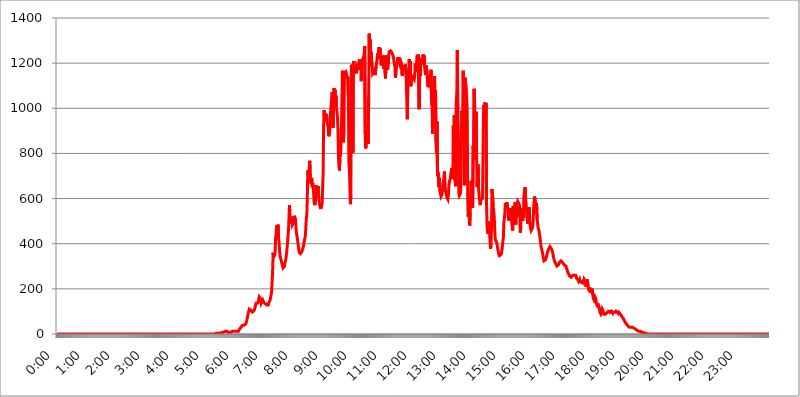
| Category | 2015.05.04. Intenzitás [W/m^2] |
|---|---|
| 0.0 | 0 |
| 0.0006944444444444445 | 0 |
| 0.001388888888888889 | 0 |
| 0.0020833333333333333 | 0 |
| 0.002777777777777778 | 0 |
| 0.003472222222222222 | 0 |
| 0.004166666666666667 | 0 |
| 0.004861111111111111 | 0 |
| 0.005555555555555556 | 0 |
| 0.0062499999999999995 | 0 |
| 0.006944444444444444 | 0 |
| 0.007638888888888889 | 0 |
| 0.008333333333333333 | 0 |
| 0.009027777777777779 | 0 |
| 0.009722222222222222 | 0 |
| 0.010416666666666666 | 0 |
| 0.011111111111111112 | 0 |
| 0.011805555555555555 | 0 |
| 0.012499999999999999 | 0 |
| 0.013194444444444444 | 0 |
| 0.013888888888888888 | 0 |
| 0.014583333333333332 | 0 |
| 0.015277777777777777 | 0 |
| 0.015972222222222224 | 0 |
| 0.016666666666666666 | 0 |
| 0.017361111111111112 | 0 |
| 0.018055555555555557 | 0 |
| 0.01875 | 0 |
| 0.019444444444444445 | 0 |
| 0.02013888888888889 | 0 |
| 0.020833333333333332 | 0 |
| 0.02152777777777778 | 0 |
| 0.022222222222222223 | 0 |
| 0.02291666666666667 | 0 |
| 0.02361111111111111 | 0 |
| 0.024305555555555556 | 0 |
| 0.024999999999999998 | 0 |
| 0.025694444444444447 | 0 |
| 0.02638888888888889 | 0 |
| 0.027083333333333334 | 0 |
| 0.027777777777777776 | 0 |
| 0.02847222222222222 | 0 |
| 0.029166666666666664 | 0 |
| 0.029861111111111113 | 0 |
| 0.030555555555555555 | 0 |
| 0.03125 | 0 |
| 0.03194444444444445 | 0 |
| 0.03263888888888889 | 0 |
| 0.03333333333333333 | 0 |
| 0.034027777777777775 | 0 |
| 0.034722222222222224 | 0 |
| 0.035416666666666666 | 0 |
| 0.036111111111111115 | 0 |
| 0.03680555555555556 | 0 |
| 0.0375 | 0 |
| 0.03819444444444444 | 0 |
| 0.03888888888888889 | 0 |
| 0.03958333333333333 | 0 |
| 0.04027777777777778 | 0 |
| 0.04097222222222222 | 0 |
| 0.041666666666666664 | 0 |
| 0.042361111111111106 | 0 |
| 0.04305555555555556 | 0 |
| 0.043750000000000004 | 0 |
| 0.044444444444444446 | 0 |
| 0.04513888888888889 | 0 |
| 0.04583333333333334 | 0 |
| 0.04652777777777778 | 0 |
| 0.04722222222222222 | 0 |
| 0.04791666666666666 | 0 |
| 0.04861111111111111 | 0 |
| 0.049305555555555554 | 0 |
| 0.049999999999999996 | 0 |
| 0.05069444444444445 | 0 |
| 0.051388888888888894 | 0 |
| 0.052083333333333336 | 0 |
| 0.05277777777777778 | 0 |
| 0.05347222222222222 | 0 |
| 0.05416666666666667 | 0 |
| 0.05486111111111111 | 0 |
| 0.05555555555555555 | 0 |
| 0.05625 | 0 |
| 0.05694444444444444 | 0 |
| 0.057638888888888885 | 0 |
| 0.05833333333333333 | 0 |
| 0.05902777777777778 | 0 |
| 0.059722222222222225 | 0 |
| 0.06041666666666667 | 0 |
| 0.061111111111111116 | 0 |
| 0.06180555555555556 | 0 |
| 0.0625 | 0 |
| 0.06319444444444444 | 0 |
| 0.06388888888888888 | 0 |
| 0.06458333333333334 | 0 |
| 0.06527777777777778 | 0 |
| 0.06597222222222222 | 0 |
| 0.06666666666666667 | 0 |
| 0.06736111111111111 | 0 |
| 0.06805555555555555 | 0 |
| 0.06874999999999999 | 0 |
| 0.06944444444444443 | 0 |
| 0.07013888888888889 | 0 |
| 0.07083333333333333 | 0 |
| 0.07152777777777779 | 0 |
| 0.07222222222222223 | 0 |
| 0.07291666666666667 | 0 |
| 0.07361111111111111 | 0 |
| 0.07430555555555556 | 0 |
| 0.075 | 0 |
| 0.07569444444444444 | 0 |
| 0.0763888888888889 | 0 |
| 0.07708333333333334 | 0 |
| 0.07777777777777778 | 0 |
| 0.07847222222222222 | 0 |
| 0.07916666666666666 | 0 |
| 0.0798611111111111 | 0 |
| 0.08055555555555556 | 0 |
| 0.08125 | 0 |
| 0.08194444444444444 | 0 |
| 0.08263888888888889 | 0 |
| 0.08333333333333333 | 0 |
| 0.08402777777777777 | 0 |
| 0.08472222222222221 | 0 |
| 0.08541666666666665 | 0 |
| 0.08611111111111112 | 0 |
| 0.08680555555555557 | 0 |
| 0.08750000000000001 | 0 |
| 0.08819444444444445 | 0 |
| 0.08888888888888889 | 0 |
| 0.08958333333333333 | 0 |
| 0.09027777777777778 | 0 |
| 0.09097222222222222 | 0 |
| 0.09166666666666667 | 0 |
| 0.09236111111111112 | 0 |
| 0.09305555555555556 | 0 |
| 0.09375 | 0 |
| 0.09444444444444444 | 0 |
| 0.09513888888888888 | 0 |
| 0.09583333333333333 | 0 |
| 0.09652777777777777 | 0 |
| 0.09722222222222222 | 0 |
| 0.09791666666666667 | 0 |
| 0.09861111111111111 | 0 |
| 0.09930555555555555 | 0 |
| 0.09999999999999999 | 0 |
| 0.10069444444444443 | 0 |
| 0.1013888888888889 | 0 |
| 0.10208333333333335 | 0 |
| 0.10277777777777779 | 0 |
| 0.10347222222222223 | 0 |
| 0.10416666666666667 | 0 |
| 0.10486111111111111 | 0 |
| 0.10555555555555556 | 0 |
| 0.10625 | 0 |
| 0.10694444444444444 | 0 |
| 0.1076388888888889 | 0 |
| 0.10833333333333334 | 0 |
| 0.10902777777777778 | 0 |
| 0.10972222222222222 | 0 |
| 0.1111111111111111 | 0 |
| 0.11180555555555556 | 0 |
| 0.11180555555555556 | 0 |
| 0.1125 | 0 |
| 0.11319444444444444 | 0 |
| 0.11388888888888889 | 0 |
| 0.11458333333333333 | 0 |
| 0.11527777777777777 | 0 |
| 0.11597222222222221 | 0 |
| 0.11666666666666665 | 0 |
| 0.1173611111111111 | 0 |
| 0.11805555555555557 | 0 |
| 0.11944444444444445 | 0 |
| 0.12013888888888889 | 0 |
| 0.12083333333333333 | 0 |
| 0.12152777777777778 | 0 |
| 0.12222222222222223 | 0 |
| 0.12291666666666667 | 0 |
| 0.12291666666666667 | 0 |
| 0.12361111111111112 | 0 |
| 0.12430555555555556 | 0 |
| 0.125 | 0 |
| 0.12569444444444444 | 0 |
| 0.12638888888888888 | 0 |
| 0.12708333333333333 | 0 |
| 0.16875 | 0 |
| 0.12847222222222224 | 0 |
| 0.12916666666666668 | 0 |
| 0.12986111111111112 | 0 |
| 0.13055555555555556 | 0 |
| 0.13125 | 0 |
| 0.13194444444444445 | 0 |
| 0.1326388888888889 | 0 |
| 0.13333333333333333 | 0 |
| 0.13402777777777777 | 0 |
| 0.13402777777777777 | 0 |
| 0.13472222222222222 | 0 |
| 0.13541666666666666 | 0 |
| 0.1361111111111111 | 0 |
| 0.13749999999999998 | 0 |
| 0.13819444444444443 | 0 |
| 0.1388888888888889 | 0 |
| 0.13958333333333334 | 0 |
| 0.14027777777777778 | 0 |
| 0.14097222222222222 | 0 |
| 0.14166666666666666 | 0 |
| 0.1423611111111111 | 0 |
| 0.14305555555555557 | 0 |
| 0.14375000000000002 | 0 |
| 0.14444444444444446 | 0 |
| 0.1451388888888889 | 0 |
| 0.1451388888888889 | 0 |
| 0.14652777777777778 | 0 |
| 0.14722222222222223 | 0 |
| 0.14791666666666667 | 0 |
| 0.1486111111111111 | 0 |
| 0.14930555555555555 | 0 |
| 0.15 | 0 |
| 0.15069444444444444 | 0 |
| 0.15138888888888888 | 0 |
| 0.15208333333333332 | 0 |
| 0.15277777777777776 | 0 |
| 0.15347222222222223 | 0 |
| 0.15416666666666667 | 0 |
| 0.15486111111111112 | 0 |
| 0.15555555555555556 | 0 |
| 0.15625 | 0 |
| 0.15694444444444444 | 0 |
| 0.15763888888888888 | 0 |
| 0.15833333333333333 | 0 |
| 0.15902777777777777 | 0 |
| 0.15972222222222224 | 0 |
| 0.16041666666666668 | 0 |
| 0.16111111111111112 | 0 |
| 0.16180555555555556 | 0 |
| 0.1625 | 0 |
| 0.16319444444444445 | 0 |
| 0.1638888888888889 | 0 |
| 0.16458333333333333 | 0 |
| 0.16527777777777777 | 0 |
| 0.16597222222222222 | 0 |
| 0.16666666666666666 | 0 |
| 0.1673611111111111 | 0 |
| 0.16805555555555554 | 0 |
| 0.16874999999999998 | 0 |
| 0.16944444444444443 | 0 |
| 0.17013888888888887 | 0 |
| 0.1708333333333333 | 0 |
| 0.17152777777777775 | 0 |
| 0.17222222222222225 | 0 |
| 0.1729166666666667 | 0 |
| 0.17361111111111113 | 0 |
| 0.17430555555555557 | 0 |
| 0.17500000000000002 | 0 |
| 0.17569444444444446 | 0 |
| 0.1763888888888889 | 0 |
| 0.17708333333333334 | 0 |
| 0.17777777777777778 | 0 |
| 0.17847222222222223 | 0 |
| 0.17916666666666667 | 0 |
| 0.1798611111111111 | 0 |
| 0.18055555555555555 | 0 |
| 0.18125 | 0 |
| 0.18194444444444444 | 0 |
| 0.1826388888888889 | 0 |
| 0.18333333333333335 | 0 |
| 0.1840277777777778 | 0 |
| 0.18472222222222223 | 0 |
| 0.18541666666666667 | 0 |
| 0.18611111111111112 | 0 |
| 0.18680555555555556 | 0 |
| 0.1875 | 0 |
| 0.18819444444444444 | 0 |
| 0.18888888888888888 | 0 |
| 0.18958333333333333 | 0 |
| 0.19027777777777777 | 0 |
| 0.1909722222222222 | 0 |
| 0.19166666666666665 | 0 |
| 0.19236111111111112 | 0 |
| 0.19305555555555554 | 0 |
| 0.19375 | 0 |
| 0.19444444444444445 | 0 |
| 0.1951388888888889 | 0 |
| 0.19583333333333333 | 0 |
| 0.19652777777777777 | 0 |
| 0.19722222222222222 | 0 |
| 0.19791666666666666 | 0 |
| 0.1986111111111111 | 0 |
| 0.19930555555555554 | 0 |
| 0.19999999999999998 | 0 |
| 0.20069444444444443 | 0 |
| 0.20138888888888887 | 0 |
| 0.2020833333333333 | 0 |
| 0.2027777777777778 | 0 |
| 0.2034722222222222 | 0 |
| 0.2041666666666667 | 0 |
| 0.20486111111111113 | 0 |
| 0.20555555555555557 | 0 |
| 0.20625000000000002 | 0 |
| 0.20694444444444446 | 0 |
| 0.2076388888888889 | 0 |
| 0.20833333333333334 | 0 |
| 0.20902777777777778 | 0 |
| 0.20972222222222223 | 0 |
| 0.21041666666666667 | 0 |
| 0.2111111111111111 | 0 |
| 0.21180555555555555 | 0 |
| 0.2125 | 0 |
| 0.21319444444444444 | 0 |
| 0.2138888888888889 | 0 |
| 0.21458333333333335 | 0 |
| 0.2152777777777778 | 0 |
| 0.21597222222222223 | 0 |
| 0.21666666666666667 | 0 |
| 0.21736111111111112 | 0 |
| 0.21805555555555556 | 0 |
| 0.21875 | 0 |
| 0.21944444444444444 | 0 |
| 0.22013888888888888 | 0 |
| 0.22083333333333333 | 0 |
| 0.22152777777777777 | 0 |
| 0.2222222222222222 | 3.525 |
| 0.22291666666666665 | 3.525 |
| 0.2236111111111111 | 3.525 |
| 0.22430555555555556 | 3.525 |
| 0.225 | 3.525 |
| 0.22569444444444445 | 3.525 |
| 0.2263888888888889 | 3.525 |
| 0.22708333333333333 | 3.525 |
| 0.22777777777777777 | 3.525 |
| 0.22847222222222222 | 3.525 |
| 0.22916666666666666 | 3.525 |
| 0.2298611111111111 | 7.887 |
| 0.23055555555555554 | 7.887 |
| 0.23124999999999998 | 7.887 |
| 0.23194444444444443 | 7.887 |
| 0.23263888888888887 | 7.887 |
| 0.2333333333333333 | 7.887 |
| 0.2340277777777778 | 7.887 |
| 0.2347222222222222 | 7.887 |
| 0.2354166666666667 | 12.257 |
| 0.23611111111111113 | 12.257 |
| 0.23680555555555557 | 12.257 |
| 0.23750000000000002 | 12.257 |
| 0.23819444444444446 | 7.887 |
| 0.2388888888888889 | 7.887 |
| 0.23958333333333334 | 7.887 |
| 0.24027777777777778 | 7.887 |
| 0.24097222222222223 | 7.887 |
| 0.24166666666666667 | 7.887 |
| 0.2423611111111111 | 7.887 |
| 0.24305555555555555 | 7.887 |
| 0.24375 | 7.887 |
| 0.24444444444444446 | 7.887 |
| 0.24513888888888888 | 7.887 |
| 0.24583333333333335 | 12.257 |
| 0.2465277777777778 | 12.257 |
| 0.24722222222222223 | 12.257 |
| 0.24791666666666667 | 12.257 |
| 0.24861111111111112 | 12.257 |
| 0.24930555555555556 | 12.257 |
| 0.25 | 12.257 |
| 0.25069444444444444 | 12.257 |
| 0.2513888888888889 | 12.257 |
| 0.2520833333333333 | 12.257 |
| 0.25277777777777777 | 12.257 |
| 0.2534722222222222 | 12.257 |
| 0.25416666666666665 | 12.257 |
| 0.2548611111111111 | 16.636 |
| 0.2555555555555556 | 21.024 |
| 0.25625000000000003 | 21.024 |
| 0.2569444444444445 | 25.419 |
| 0.2576388888888889 | 29.823 |
| 0.25833333333333336 | 34.234 |
| 0.2590277777777778 | 34.234 |
| 0.25972222222222224 | 38.653 |
| 0.2604166666666667 | 34.234 |
| 0.2611111111111111 | 34.234 |
| 0.26180555555555557 | 38.653 |
| 0.2625 | 38.653 |
| 0.26319444444444445 | 38.653 |
| 0.2638888888888889 | 43.079 |
| 0.26458333333333334 | 47.511 |
| 0.2652777777777778 | 51.951 |
| 0.2659722222222222 | 60.85 |
| 0.26666666666666666 | 74.246 |
| 0.2673611111111111 | 83.205 |
| 0.26805555555555555 | 96.682 |
| 0.26875 | 101.184 |
| 0.26944444444444443 | 110.201 |
| 0.2701388888888889 | 110.201 |
| 0.2708333333333333 | 110.201 |
| 0.27152777777777776 | 105.69 |
| 0.2722222222222222 | 101.184 |
| 0.27291666666666664 | 101.184 |
| 0.2736111111111111 | 96.682 |
| 0.2743055555555555 | 96.682 |
| 0.27499999999999997 | 101.184 |
| 0.27569444444444446 | 101.184 |
| 0.27638888888888885 | 105.69 |
| 0.27708333333333335 | 114.716 |
| 0.2777777777777778 | 123.758 |
| 0.27847222222222223 | 132.814 |
| 0.2791666666666667 | 137.347 |
| 0.2798611111111111 | 137.347 |
| 0.28055555555555556 | 137.347 |
| 0.28125 | 137.347 |
| 0.28194444444444444 | 141.884 |
| 0.2826388888888889 | 155.509 |
| 0.2833333333333333 | 164.605 |
| 0.28402777777777777 | 164.605 |
| 0.2847222222222222 | 164.605 |
| 0.28541666666666665 | 155.509 |
| 0.28611111111111115 | 137.347 |
| 0.28680555555555554 | 137.347 |
| 0.28750000000000003 | 146.423 |
| 0.2881944444444445 | 150.964 |
| 0.2888888888888889 | 150.964 |
| 0.28958333333333336 | 141.884 |
| 0.2902777777777778 | 137.347 |
| 0.29097222222222224 | 137.347 |
| 0.2916666666666667 | 137.347 |
| 0.2923611111111111 | 132.814 |
| 0.29305555555555557 | 132.814 |
| 0.29375 | 128.284 |
| 0.29444444444444445 | 128.284 |
| 0.2951388888888889 | 128.284 |
| 0.29583333333333334 | 128.284 |
| 0.2965277777777778 | 137.347 |
| 0.2972222222222222 | 141.884 |
| 0.29791666666666666 | 146.423 |
| 0.2986111111111111 | 150.964 |
| 0.29930555555555555 | 164.605 |
| 0.3 | 173.709 |
| 0.30069444444444443 | 191.937 |
| 0.3013888888888889 | 233 |
| 0.3020833333333333 | 283.156 |
| 0.30277777777777776 | 360.221 |
| 0.3034722222222222 | 342.162 |
| 0.30416666666666664 | 342.162 |
| 0.3048611111111111 | 346.682 |
| 0.3055555555555555 | 360.221 |
| 0.30624999999999997 | 422.943 |
| 0.3069444444444444 | 440.702 |
| 0.3076388888888889 | 480.356 |
| 0.30833333333333335 | 431.833 |
| 0.3090277777777778 | 462.786 |
| 0.30972222222222223 | 484.735 |
| 0.3104166666666667 | 422.943 |
| 0.3111111111111111 | 405.108 |
| 0.31180555555555556 | 369.23 |
| 0.3125 | 346.682 |
| 0.31319444444444444 | 346.682 |
| 0.3138888888888889 | 328.584 |
| 0.3145833333333333 | 319.517 |
| 0.31527777777777777 | 319.517 |
| 0.3159722222222222 | 301.354 |
| 0.31666666666666665 | 292.259 |
| 0.31736111111111115 | 292.259 |
| 0.31805555555555554 | 296.808 |
| 0.31875000000000003 | 301.354 |
| 0.3194444444444445 | 314.98 |
| 0.3201388888888889 | 324.052 |
| 0.32083333333333336 | 337.639 |
| 0.3215277777777778 | 355.712 |
| 0.32222222222222224 | 378.224 |
| 0.3229166666666667 | 400.638 |
| 0.3236111111111111 | 431.833 |
| 0.32430555555555557 | 458.38 |
| 0.325 | 458.38 |
| 0.32569444444444445 | 571.049 |
| 0.3263888888888889 | 510.885 |
| 0.32708333333333334 | 497.836 |
| 0.3277777777777778 | 489.108 |
| 0.3284722222222222 | 484.735 |
| 0.32916666666666666 | 519.555 |
| 0.3298611111111111 | 484.735 |
| 0.33055555555555555 | 480.356 |
| 0.33125 | 493.475 |
| 0.33194444444444443 | 510.885 |
| 0.3326388888888889 | 523.88 |
| 0.3333333333333333 | 523.88 |
| 0.3340277777777778 | 506.542 |
| 0.3347222222222222 | 480.356 |
| 0.3354166666666667 | 449.551 |
| 0.3361111111111111 | 436.27 |
| 0.3368055555555556 | 422.943 |
| 0.33749999999999997 | 405.108 |
| 0.33819444444444446 | 387.202 |
| 0.33888888888888885 | 369.23 |
| 0.33958333333333335 | 360.221 |
| 0.34027777777777773 | 360.221 |
| 0.34097222222222223 | 355.712 |
| 0.3416666666666666 | 355.712 |
| 0.3423611111111111 | 355.712 |
| 0.3430555555555555 | 364.728 |
| 0.34375 | 373.729 |
| 0.3444444444444445 | 378.224 |
| 0.3451388888888889 | 387.202 |
| 0.3458333333333334 | 396.164 |
| 0.34652777777777777 | 414.035 |
| 0.34722222222222227 | 422.943 |
| 0.34791666666666665 | 431.833 |
| 0.34861111111111115 | 471.582 |
| 0.34930555555555554 | 510.885 |
| 0.35000000000000003 | 528.2 |
| 0.3506944444444444 | 600.661 |
| 0.3513888888888889 | 723.889 |
| 0.3520833333333333 | 727.896 |
| 0.3527777777777778 | 703.762 |
| 0.3534722222222222 | 731.896 |
| 0.3541666666666667 | 767.62 |
| 0.3548611111111111 | 691.608 |
| 0.35555555555555557 | 667.123 |
| 0.35625 | 683.473 |
| 0.35694444444444445 | 691.608 |
| 0.3576388888888889 | 650.667 |
| 0.35833333333333334 | 667.123 |
| 0.3590277777777778 | 650.667 |
| 0.3597222222222222 | 617.436 |
| 0.36041666666666666 | 579.542 |
| 0.3611111111111111 | 571.049 |
| 0.36180555555555555 | 579.542 |
| 0.3625 | 596.45 |
| 0.36319444444444443 | 658.909 |
| 0.3638888888888889 | 634.105 |
| 0.3645833333333333 | 625.784 |
| 0.3652777777777778 | 617.436 |
| 0.3659722222222222 | 654.791 |
| 0.3666666666666667 | 604.864 |
| 0.3673611111111111 | 588.009 |
| 0.3680555555555556 | 571.049 |
| 0.36874999999999997 | 566.793 |
| 0.36944444444444446 | 553.986 |
| 0.37013888888888885 | 549.704 |
| 0.37083333333333335 | 553.986 |
| 0.37152777777777773 | 579.542 |
| 0.37222222222222223 | 583.779 |
| 0.3729166666666666 | 711.832 |
| 0.3736111111111111 | 925.06 |
| 0.3743055555555555 | 992.448 |
| 0.375 | 940.082 |
| 0.3756944444444445 | 977.508 |
| 0.3763888888888889 | 951.327 |
| 0.3770833333333334 | 955.071 |
| 0.37777777777777777 | 973.772 |
| 0.37847222222222227 | 943.832 |
| 0.37916666666666665 | 928.819 |
| 0.37986111111111115 | 913.766 |
| 0.38055555555555554 | 875.918 |
| 0.38125000000000003 | 872.114 |
| 0.3819444444444444 | 887.309 |
| 0.3826388888888889 | 925.06 |
| 0.3833333333333333 | 981.244 |
| 0.3840277777777778 | 977.508 |
| 0.3847222222222222 | 1037.277 |
| 0.3854166666666667 | 1071.027 |
| 0.3861111111111111 | 1059.756 |
| 0.38680555555555557 | 913.766 |
| 0.3875 | 1018.587 |
| 0.38819444444444445 | 1089.873 |
| 0.3888888888888889 | 1037.277 |
| 0.38958333333333334 | 1082.324 |
| 0.3902777777777778 | 1014.852 |
| 0.3909722222222222 | 1056.004 |
| 0.39166666666666666 | 999.916 |
| 0.3923611111111111 | 984.98 |
| 0.39305555555555555 | 958.814 |
| 0.39375 | 902.447 |
| 0.39444444444444443 | 783.342 |
| 0.3951388888888889 | 739.877 |
| 0.3958333333333333 | 723.889 |
| 0.3965277777777778 | 802.868 |
| 0.3972222222222222 | 787.258 |
| 0.3979166666666667 | 860.676 |
| 0.3986111111111111 | 917.534 |
| 0.3993055555555556 | 913.766 |
| 0.39999999999999997 | 1166.46 |
| 0.40069444444444446 | 932.576 |
| 0.40138888888888885 | 849.199 |
| 0.40208333333333335 | 906.223 |
| 0.40277777777777773 | 1158.689 |
| 0.40347222222222223 | 1158.689 |
| 0.4041666666666666 | 1162.571 |
| 0.4048611111111111 | 1162.571 |
| 0.4055555555555555 | 1154.814 |
| 0.40625 | 1143.232 |
| 0.4069444444444445 | 1131.708 |
| 0.4076388888888889 | 1139.384 |
| 0.4083333333333334 | 1052.255 |
| 0.40902777777777777 | 755.766 |
| 0.40972222222222227 | 727.896 |
| 0.41041666666666665 | 650.667 |
| 0.41111111111111115 | 575.299 |
| 0.41180555555555554 | 617.436 |
| 0.41250000000000003 | 1189.969 |
| 0.4131944444444444 | 1120.238 |
| 0.4138888888888889 | 1193.918 |
| 0.4145833333333333 | 802.868 |
| 0.4152777777777778 | 1178.177 |
| 0.4159722222222222 | 1209.807 |
| 0.4166666666666667 | 1154.814 |
| 0.4173611111111111 | 1193.918 |
| 0.41805555555555557 | 1193.918 |
| 0.41875 | 1182.099 |
| 0.41944444444444445 | 1154.814 |
| 0.4201388888888889 | 1158.689 |
| 0.42083333333333334 | 1186.03 |
| 0.4215277777777778 | 1186.03 |
| 0.4222222222222222 | 1186.03 |
| 0.42291666666666666 | 1170.358 |
| 0.4236111111111111 | 1209.807 |
| 0.42430555555555555 | 1209.807 |
| 0.425 | 1209.807 |
| 0.42569444444444443 | 1205.82 |
| 0.4263888888888889 | 1120.238 |
| 0.4270833333333333 | 1217.812 |
| 0.4277777777777778 | 1205.82 |
| 0.4284722222222222 | 1205.82 |
| 0.4291666666666667 | 1221.83 |
| 0.4298611111111111 | 1225.859 |
| 0.4305555555555556 | 1242.089 |
| 0.43124999999999997 | 1275.142 |
| 0.43194444444444446 | 887.309 |
| 0.43263888888888885 | 822.26 |
| 0.43333333333333335 | 845.365 |
| 0.43402777777777773 | 925.06 |
| 0.43472222222222223 | 917.534 |
| 0.4354166666666666 | 902.447 |
| 0.4361111111111111 | 841.526 |
| 0.4368055555555555 | 1052.255 |
| 0.4375 | 1330.826 |
| 0.4381944444444445 | 1186.03 |
| 0.4388888888888889 | 1304.795 |
| 0.4395833333333334 | 1229.899 |
| 0.44027777777777777 | 1250.275 |
| 0.44097222222222227 | 1209.807 |
| 0.44166666666666665 | 1193.918 |
| 0.44236111111111115 | 1154.814 |
| 0.44305555555555554 | 1154.814 |
| 0.44375000000000003 | 1150.946 |
| 0.4444444444444444 | 1166.46 |
| 0.4451388888888889 | 1162.571 |
| 0.4458333333333333 | 1147.086 |
| 0.4465277777777778 | 1143.232 |
| 0.4472222222222222 | 1186.03 |
| 0.4479166666666667 | 1189.969 |
| 0.4486111111111111 | 1217.812 |
| 0.44930555555555557 | 1242.089 |
| 0.45 | 1217.812 |
| 0.45069444444444445 | 1254.387 |
| 0.4513888888888889 | 1270.964 |
| 0.45208333333333334 | 1254.387 |
| 0.4527777777777778 | 1266.8 |
| 0.4534722222222222 | 1221.83 |
| 0.45416666666666666 | 1189.969 |
| 0.4548611111111111 | 1186.03 |
| 0.45555555555555555 | 1205.82 |
| 0.45625 | 1217.812 |
| 0.45694444444444443 | 1233.951 |
| 0.4576388888888889 | 1229.899 |
| 0.4583333333333333 | 1174.263 |
| 0.4590277777777778 | 1229.899 |
| 0.4597222222222222 | 1158.689 |
| 0.4604166666666667 | 1131.708 |
| 0.4611111111111111 | 1233.951 |
| 0.4618055555555556 | 1193.918 |
| 0.46249999999999997 | 1182.099 |
| 0.46319444444444446 | 1170.358 |
| 0.46388888888888885 | 1182.099 |
| 0.46458333333333335 | 1205.82 |
| 0.46527777777777773 | 1250.275 |
| 0.46597222222222223 | 1246.176 |
| 0.4666666666666666 | 1254.387 |
| 0.4673611111111111 | 1254.387 |
| 0.4680555555555555 | 1258.511 |
| 0.46875 | 1250.275 |
| 0.4694444444444445 | 1246.176 |
| 0.4701388888888889 | 1242.089 |
| 0.4708333333333334 | 1233.951 |
| 0.47152777777777777 | 1225.859 |
| 0.47222222222222227 | 1209.807 |
| 0.47291666666666665 | 1209.807 |
| 0.47361111111111115 | 1182.099 |
| 0.47430555555555554 | 1135.543 |
| 0.47500000000000003 | 1150.946 |
| 0.4756944444444444 | 1178.177 |
| 0.4763888888888889 | 1193.918 |
| 0.4770833333333333 | 1213.804 |
| 0.4777777777777778 | 1225.859 |
| 0.4784722222222222 | 1217.812 |
| 0.4791666666666667 | 1225.859 |
| 0.4798611111111111 | 1201.843 |
| 0.48055555555555557 | 1193.918 |
| 0.48125 | 1197.876 |
| 0.48194444444444445 | 1205.82 |
| 0.4826388888888889 | 1197.876 |
| 0.48333333333333334 | 1150.946 |
| 0.4840277777777778 | 1143.232 |
| 0.4847222222222222 | 1139.384 |
| 0.48541666666666666 | 1170.358 |
| 0.4861111111111111 | 1174.263 |
| 0.48680555555555555 | 1189.969 |
| 0.4875 | 1166.46 |
| 0.48819444444444443 | 1193.918 |
| 0.4888888888888889 | 1170.358 |
| 0.4895833333333333 | 1112.618 |
| 0.4902777777777778 | 1116.426 |
| 0.4909722222222222 | 951.327 |
| 0.4916666666666667 | 1108.816 |
| 0.4923611111111111 | 1158.689 |
| 0.4930555555555556 | 1174.263 |
| 0.49374999999999997 | 1217.812 |
| 0.49444444444444446 | 1162.571 |
| 0.49513888888888885 | 1209.807 |
| 0.49583333333333335 | 1097.437 |
| 0.49652777777777773 | 1101.226 |
| 0.49722222222222223 | 1147.086 |
| 0.4979166666666666 | 1139.384 |
| 0.4986111111111111 | 1127.879 |
| 0.4993055555555555 | 1135.543 |
| 0.5 | 1135.543 |
| 0.5006944444444444 | 1127.879 |
| 0.5013888888888889 | 1143.232 |
| 0.5020833333333333 | 1197.876 |
| 0.5027777777777778 | 1162.571 |
| 0.5034722222222222 | 1193.918 |
| 0.5041666666666667 | 1170.358 |
| 0.5048611111111111 | 1233.951 |
| 0.5055555555555555 | 1209.807 |
| 0.50625 | 1238.014 |
| 0.5069444444444444 | 1238.014 |
| 0.5076388888888889 | 996.182 |
| 0.5083333333333333 | 1162.571 |
| 0.5090277777777777 | 1143.232 |
| 0.5097222222222222 | 1197.876 |
| 0.5104166666666666 | 1209.807 |
| 0.5111111111111112 | 1213.804 |
| 0.5118055555555555 | 1201.843 |
| 0.5125000000000001 | 1193.918 |
| 0.5131944444444444 | 1238.014 |
| 0.513888888888889 | 1221.83 |
| 0.5145833333333333 | 1233.951 |
| 0.5152777777777778 | 1182.099 |
| 0.5159722222222222 | 1182.099 |
| 0.5166666666666667 | 1147.086 |
| 0.517361111111111 | 1189.969 |
| 0.5180555555555556 | 1186.03 |
| 0.5187499999999999 | 1158.689 |
| 0.5194444444444445 | 1108.816 |
| 0.5201388888888888 | 1093.653 |
| 0.5208333333333334 | 1127.879 |
| 0.5215277777777778 | 1147.086 |
| 0.5222222222222223 | 1093.653 |
| 0.5229166666666667 | 1120.238 |
| 0.5236111111111111 | 1150.946 |
| 0.5243055555555556 | 1170.358 |
| 0.525 | 1018.587 |
| 0.5256944444444445 | 1007.383 |
| 0.5263888888888889 | 887.309 |
| 0.5270833333333333 | 996.182 |
| 0.5277777777777778 | 1056.004 |
| 0.5284722222222222 | 988.714 |
| 0.5291666666666667 | 1143.232 |
| 0.5298611111111111 | 955.071 |
| 0.5305555555555556 | 1078.555 |
| 0.53125 | 849.199 |
| 0.5319444444444444 | 798.974 |
| 0.5326388888888889 | 940.082 |
| 0.5333333333333333 | 699.717 |
| 0.5340277777777778 | 715.858 |
| 0.5347222222222222 | 715.858 |
| 0.5354166666666667 | 650.667 |
| 0.5361111111111111 | 691.608 |
| 0.5368055555555555 | 634.105 |
| 0.5375 | 621.613 |
| 0.5381944444444444 | 609.062 |
| 0.5388888888888889 | 604.864 |
| 0.5395833333333333 | 617.436 |
| 0.5402777777777777 | 621.613 |
| 0.5409722222222222 | 650.667 |
| 0.5416666666666666 | 671.22 |
| 0.5423611111111112 | 675.311 |
| 0.5430555555555555 | 719.877 |
| 0.5437500000000001 | 658.909 |
| 0.5444444444444444 | 638.256 |
| 0.545138888888889 | 625.784 |
| 0.5458333333333333 | 613.252 |
| 0.5465277777777778 | 604.864 |
| 0.5472222222222222 | 600.661 |
| 0.5479166666666667 | 596.45 |
| 0.548611111111111 | 617.436 |
| 0.5493055555555556 | 654.791 |
| 0.5499999999999999 | 675.311 |
| 0.5506944444444445 | 683.473 |
| 0.5513888888888888 | 691.608 |
| 0.5520833333333334 | 711.832 |
| 0.5527777777777778 | 711.832 |
| 0.5534722222222223 | 735.89 |
| 0.5541666666666667 | 687.544 |
| 0.5548611111111111 | 695.666 |
| 0.5555555555555556 | 925.06 |
| 0.55625 | 687.544 |
| 0.5569444444444445 | 970.034 |
| 0.5576388888888889 | 683.473 |
| 0.5583333333333333 | 671.22 |
| 0.5590277777777778 | 654.791 |
| 0.5597222222222222 | 1029.798 |
| 0.5604166666666667 | 1074.789 |
| 0.5611111111111111 | 1258.511 |
| 0.5618055555555556 | 981.244 |
| 0.5625 | 902.447 |
| 0.5631944444444444 | 625.784 |
| 0.5638888888888889 | 613.252 |
| 0.5645833333333333 | 609.062 |
| 0.5652777777777778 | 621.613 |
| 0.5659722222222222 | 638.256 |
| 0.5666666666666667 | 642.4 |
| 0.5673611111111111 | 988.714 |
| 0.5680555555555555 | 909.996 |
| 0.56875 | 849.199 |
| 0.5694444444444444 | 1166.46 |
| 0.5701388888888889 | 1007.383 |
| 0.5708333333333333 | 658.909 |
| 0.5715277777777777 | 671.22 |
| 0.5722222222222222 | 1135.543 |
| 0.5729166666666666 | 1139.384 |
| 0.5736111111111112 | 1074.789 |
| 0.5743055555555555 | 1044.762 |
| 0.5750000000000001 | 988.714 |
| 0.5756944444444444 | 609.062 |
| 0.576388888888889 | 519.555 |
| 0.5770833333333333 | 549.704 |
| 0.5777777777777778 | 519.555 |
| 0.5784722222222222 | 480.356 |
| 0.5791666666666667 | 536.82 |
| 0.579861111111111 | 621.613 |
| 0.5805555555555556 | 679.395 |
| 0.5812499999999999 | 617.436 |
| 0.5819444444444445 | 575.299 |
| 0.5826388888888888 | 558.261 |
| 0.5833333333333334 | 833.834 |
| 0.5840277777777778 | 806.757 |
| 0.5847222222222223 | 1086.097 |
| 0.5854166666666667 | 1014.852 |
| 0.5861111111111111 | 951.327 |
| 0.5868055555555556 | 771.559 |
| 0.5875 | 984.98 |
| 0.5881944444444445 | 783.342 |
| 0.5888888888888889 | 650.667 |
| 0.5895833333333333 | 703.762 |
| 0.5902777777777778 | 751.803 |
| 0.5909722222222222 | 642.4 |
| 0.5916666666666667 | 613.252 |
| 0.5923611111111111 | 592.233 |
| 0.5930555555555556 | 571.049 |
| 0.59375 | 583.779 |
| 0.5944444444444444 | 596.45 |
| 0.5951388888888889 | 600.661 |
| 0.5958333333333333 | 592.233 |
| 0.5965277777777778 | 600.661 |
| 0.5972222222222222 | 814.519 |
| 0.5979166666666667 | 1014.852 |
| 0.5986111111111111 | 909.996 |
| 0.5993055555555555 | 940.082 |
| 0.6 | 1026.06 |
| 0.6006944444444444 | 955.071 |
| 0.6013888888888889 | 1022.323 |
| 0.6020833333333333 | 575.299 |
| 0.6027777777777777 | 484.735 |
| 0.6034722222222222 | 445.129 |
| 0.6041666666666666 | 440.702 |
| 0.6048611111111112 | 497.836 |
| 0.6055555555555555 | 493.475 |
| 0.6062500000000001 | 453.968 |
| 0.6069444444444444 | 414.035 |
| 0.607638888888889 | 378.224 |
| 0.6083333333333333 | 391.685 |
| 0.6090277777777778 | 462.786 |
| 0.6097222222222222 | 642.4 |
| 0.6104166666666667 | 617.436 |
| 0.611111111111111 | 600.661 |
| 0.6118055555555556 | 549.704 |
| 0.6124999999999999 | 536.82 |
| 0.6131944444444445 | 497.836 |
| 0.6138888888888888 | 440.702 |
| 0.6145833333333334 | 414.035 |
| 0.6152777777777778 | 414.035 |
| 0.6159722222222223 | 409.574 |
| 0.6166666666666667 | 400.638 |
| 0.6173611111111111 | 387.202 |
| 0.6180555555555556 | 373.729 |
| 0.61875 | 360.221 |
| 0.6194444444444445 | 351.198 |
| 0.6201388888888889 | 346.682 |
| 0.6208333333333333 | 346.682 |
| 0.6215277777777778 | 346.682 |
| 0.6222222222222222 | 351.198 |
| 0.6229166666666667 | 355.712 |
| 0.6236111111111111 | 369.23 |
| 0.6243055555555556 | 387.202 |
| 0.625 | 409.574 |
| 0.6256944444444444 | 427.39 |
| 0.6263888888888889 | 493.475 |
| 0.6270833333333333 | 497.836 |
| 0.6277777777777778 | 532.513 |
| 0.6284722222222222 | 579.542 |
| 0.6291666666666667 | 558.261 |
| 0.6298611111111111 | 553.986 |
| 0.6305555555555555 | 583.779 |
| 0.63125 | 583.779 |
| 0.6319444444444444 | 553.986 |
| 0.6326388888888889 | 515.223 |
| 0.6333333333333333 | 502.192 |
| 0.6340277777777777 | 502.192 |
| 0.6347222222222222 | 523.88 |
| 0.6354166666666666 | 536.82 |
| 0.6361111111111112 | 558.261 |
| 0.6368055555555555 | 528.2 |
| 0.6375000000000001 | 497.836 |
| 0.6381944444444444 | 467.187 |
| 0.638888888888889 | 458.38 |
| 0.6395833333333333 | 566.793 |
| 0.6402777777777778 | 502.192 |
| 0.6409722222222222 | 549.704 |
| 0.6416666666666667 | 541.121 |
| 0.642361111111111 | 583.779 |
| 0.6430555555555556 | 484.735 |
| 0.6437499999999999 | 566.793 |
| 0.6444444444444445 | 515.223 |
| 0.6451388888888888 | 579.542 |
| 0.6458333333333334 | 588.009 |
| 0.6465277777777778 | 583.779 |
| 0.6472222222222223 | 579.542 |
| 0.6479166666666667 | 575.299 |
| 0.6486111111111111 | 566.793 |
| 0.6493055555555556 | 449.551 |
| 0.65 | 462.786 |
| 0.6506944444444445 | 549.704 |
| 0.6513888888888889 | 506.542 |
| 0.6520833333333333 | 558.261 |
| 0.6527777777777778 | 502.192 |
| 0.6534722222222222 | 541.121 |
| 0.6541666666666667 | 515.223 |
| 0.6548611111111111 | 617.436 |
| 0.6555555555555556 | 642.4 |
| 0.65625 | 650.667 |
| 0.6569444444444444 | 604.864 |
| 0.6576388888888889 | 609.062 |
| 0.6583333333333333 | 541.121 |
| 0.6590277777777778 | 510.885 |
| 0.6597222222222222 | 489.108 |
| 0.6604166666666667 | 506.542 |
| 0.6611111111111111 | 536.82 |
| 0.6618055555555555 | 562.53 |
| 0.6625 | 510.885 |
| 0.6631944444444444 | 480.356 |
| 0.6638888888888889 | 467.187 |
| 0.6645833333333333 | 458.38 |
| 0.6652777777777777 | 453.968 |
| 0.6659722222222222 | 458.38 |
| 0.6666666666666666 | 471.582 |
| 0.6673611111111111 | 489.108 |
| 0.6680555555555556 | 549.704 |
| 0.6687500000000001 | 588.009 |
| 0.6694444444444444 | 609.062 |
| 0.6701388888888888 | 609.062 |
| 0.6708333333333334 | 604.864 |
| 0.6715277777777778 | 558.261 |
| 0.6722222222222222 | 579.542 |
| 0.6729166666666666 | 510.885 |
| 0.6736111111111112 | 493.475 |
| 0.6743055555555556 | 471.582 |
| 0.6749999999999999 | 467.187 |
| 0.6756944444444444 | 458.38 |
| 0.6763888888888889 | 440.702 |
| 0.6770833333333334 | 427.39 |
| 0.6777777777777777 | 409.574 |
| 0.6784722222222223 | 387.202 |
| 0.6791666666666667 | 378.224 |
| 0.6798611111111111 | 369.23 |
| 0.6805555555555555 | 360.221 |
| 0.68125 | 346.682 |
| 0.6819444444444445 | 333.113 |
| 0.6826388888888889 | 324.052 |
| 0.6833333333333332 | 324.052 |
| 0.6840277777777778 | 324.052 |
| 0.6847222222222222 | 328.584 |
| 0.6854166666666667 | 333.113 |
| 0.686111111111111 | 342.162 |
| 0.6868055555555556 | 351.198 |
| 0.6875 | 360.221 |
| 0.6881944444444444 | 369.23 |
| 0.688888888888889 | 373.729 |
| 0.6895833333333333 | 378.224 |
| 0.6902777777777778 | 382.715 |
| 0.6909722222222222 | 387.202 |
| 0.6916666666666668 | 387.202 |
| 0.6923611111111111 | 387.202 |
| 0.6930555555555555 | 378.224 |
| 0.69375 | 373.729 |
| 0.6944444444444445 | 364.728 |
| 0.6951388888888889 | 355.712 |
| 0.6958333333333333 | 342.162 |
| 0.6965277777777777 | 333.113 |
| 0.6972222222222223 | 324.052 |
| 0.6979166666666666 | 319.517 |
| 0.6986111111111111 | 314.98 |
| 0.6993055555555556 | 310.44 |
| 0.7000000000000001 | 305.898 |
| 0.7006944444444444 | 301.354 |
| 0.7013888888888888 | 301.354 |
| 0.7020833333333334 | 301.354 |
| 0.7027777777777778 | 305.898 |
| 0.7034722222222222 | 310.44 |
| 0.7041666666666666 | 314.98 |
| 0.7048611111111112 | 319.517 |
| 0.7055555555555556 | 319.517 |
| 0.7062499999999999 | 324.052 |
| 0.7069444444444444 | 324.052 |
| 0.7076388888888889 | 324.052 |
| 0.7083333333333334 | 319.517 |
| 0.7090277777777777 | 314.98 |
| 0.7097222222222223 | 314.98 |
| 0.7104166666666667 | 310.44 |
| 0.7111111111111111 | 305.898 |
| 0.7118055555555555 | 305.898 |
| 0.7125 | 305.898 |
| 0.7131944444444445 | 301.354 |
| 0.7138888888888889 | 296.808 |
| 0.7145833333333332 | 287.709 |
| 0.7152777777777778 | 283.156 |
| 0.7159722222222222 | 274.047 |
| 0.7166666666666667 | 269.49 |
| 0.717361111111111 | 264.932 |
| 0.7180555555555556 | 260.373 |
| 0.71875 | 255.813 |
| 0.7194444444444444 | 255.813 |
| 0.720138888888889 | 255.813 |
| 0.7208333333333333 | 251.251 |
| 0.7215277777777778 | 255.813 |
| 0.7222222222222222 | 255.813 |
| 0.7229166666666668 | 260.373 |
| 0.7236111111111111 | 260.373 |
| 0.7243055555555555 | 260.373 |
| 0.725 | 260.373 |
| 0.7256944444444445 | 260.373 |
| 0.7263888888888889 | 260.373 |
| 0.7270833333333333 | 260.373 |
| 0.7277777777777777 | 255.813 |
| 0.7284722222222223 | 246.689 |
| 0.7291666666666666 | 246.689 |
| 0.7298611111111111 | 242.127 |
| 0.7305555555555556 | 237.564 |
| 0.7312500000000001 | 233 |
| 0.7319444444444444 | 233 |
| 0.7326388888888888 | 242.127 |
| 0.7333333333333334 | 233 |
| 0.7340277777777778 | 233 |
| 0.7347222222222222 | 233 |
| 0.7354166666666666 | 228.436 |
| 0.7361111111111112 | 228.436 |
| 0.7368055555555556 | 233 |
| 0.7374999999999999 | 228.436 |
| 0.7381944444444444 | 233 |
| 0.7388888888888889 | 242.127 |
| 0.7395833333333334 | 237.564 |
| 0.7402777777777777 | 228.436 |
| 0.7409722222222223 | 223.873 |
| 0.7416666666666667 | 210.182 |
| 0.7423611111111111 | 233 |
| 0.7430555555555555 | 242.127 |
| 0.74375 | 233 |
| 0.7444444444444445 | 219.309 |
| 0.7451388888888889 | 196.497 |
| 0.7458333333333332 | 196.497 |
| 0.7465277777777778 | 191.937 |
| 0.7472222222222222 | 205.62 |
| 0.7479166666666667 | 182.82 |
| 0.748611111111111 | 182.82 |
| 0.7493055555555556 | 182.82 |
| 0.75 | 201.058 |
| 0.7506944444444444 | 187.378 |
| 0.751388888888889 | 164.605 |
| 0.7520833333333333 | 155.509 |
| 0.7527777777777778 | 150.964 |
| 0.7534722222222222 | 150.964 |
| 0.7541666666666668 | 164.605 |
| 0.7548611111111111 | 160.056 |
| 0.7555555555555555 | 150.964 |
| 0.75625 | 132.814 |
| 0.7569444444444445 | 128.284 |
| 0.7576388888888889 | 123.758 |
| 0.7583333333333333 | 123.758 |
| 0.7590277777777777 | 128.284 |
| 0.7597222222222223 | 128.284 |
| 0.7604166666666666 | 114.716 |
| 0.7611111111111111 | 96.682 |
| 0.7618055555555556 | 92.184 |
| 0.7625000000000001 | 87.692 |
| 0.7631944444444444 | 92.184 |
| 0.7638888888888888 | 96.682 |
| 0.7645833333333334 | 110.201 |
| 0.7652777777777778 | 105.69 |
| 0.7659722222222222 | 92.184 |
| 0.7666666666666666 | 87.692 |
| 0.7673611111111112 | 87.692 |
| 0.7680555555555556 | 87.692 |
| 0.7687499999999999 | 87.692 |
| 0.7694444444444444 | 87.692 |
| 0.7701388888888889 | 92.184 |
| 0.7708333333333334 | 92.184 |
| 0.7715277777777777 | 92.184 |
| 0.7722222222222223 | 96.682 |
| 0.7729166666666667 | 101.184 |
| 0.7736111111111111 | 101.184 |
| 0.7743055555555555 | 101.184 |
| 0.775 | 101.184 |
| 0.7756944444444445 | 96.682 |
| 0.7763888888888889 | 96.682 |
| 0.7770833333333332 | 101.184 |
| 0.7777777777777778 | 101.184 |
| 0.7784722222222222 | 96.682 |
| 0.7791666666666667 | 92.184 |
| 0.779861111111111 | 96.682 |
| 0.7805555555555556 | 96.682 |
| 0.78125 | 96.682 |
| 0.7819444444444444 | 96.682 |
| 0.782638888888889 | 96.682 |
| 0.7833333333333333 | 101.184 |
| 0.7840277777777778 | 96.682 |
| 0.7847222222222222 | 96.682 |
| 0.7854166666666668 | 96.682 |
| 0.7861111111111111 | 96.682 |
| 0.7868055555555555 | 92.184 |
| 0.7875 | 96.682 |
| 0.7881944444444445 | 96.682 |
| 0.7888888888888889 | 92.184 |
| 0.7895833333333333 | 87.692 |
| 0.7902777777777777 | 87.692 |
| 0.7909722222222223 | 83.205 |
| 0.7916666666666666 | 78.722 |
| 0.7923611111111111 | 74.246 |
| 0.7930555555555556 | 74.246 |
| 0.7937500000000001 | 69.775 |
| 0.7944444444444444 | 65.31 |
| 0.7951388888888888 | 60.85 |
| 0.7958333333333334 | 56.398 |
| 0.7965277777777778 | 51.951 |
| 0.7972222222222222 | 47.511 |
| 0.7979166666666666 | 47.511 |
| 0.7986111111111112 | 43.079 |
| 0.7993055555555556 | 38.653 |
| 0.7999999999999999 | 38.653 |
| 0.8006944444444444 | 34.234 |
| 0.8013888888888889 | 34.234 |
| 0.8020833333333334 | 29.823 |
| 0.8027777777777777 | 29.823 |
| 0.8034722222222223 | 29.823 |
| 0.8041666666666667 | 29.823 |
| 0.8048611111111111 | 29.823 |
| 0.8055555555555555 | 29.823 |
| 0.80625 | 29.823 |
| 0.8069444444444445 | 29.823 |
| 0.8076388888888889 | 25.419 |
| 0.8083333333333332 | 25.419 |
| 0.8090277777777778 | 25.419 |
| 0.8097222222222222 | 21.024 |
| 0.8104166666666667 | 21.024 |
| 0.811111111111111 | 21.024 |
| 0.8118055555555556 | 16.636 |
| 0.8125 | 16.636 |
| 0.8131944444444444 | 16.636 |
| 0.813888888888889 | 16.636 |
| 0.8145833333333333 | 12.257 |
| 0.8152777777777778 | 12.257 |
| 0.8159722222222222 | 12.257 |
| 0.8166666666666668 | 12.257 |
| 0.8173611111111111 | 12.257 |
| 0.8180555555555555 | 7.887 |
| 0.81875 | 7.887 |
| 0.8194444444444445 | 7.887 |
| 0.8201388888888889 | 7.887 |
| 0.8208333333333333 | 7.887 |
| 0.8215277777777777 | 7.887 |
| 0.8222222222222223 | 3.525 |
| 0.8229166666666666 | 3.525 |
| 0.8236111111111111 | 3.525 |
| 0.8243055555555556 | 3.525 |
| 0.8250000000000001 | 3.525 |
| 0.8256944444444444 | 3.525 |
| 0.8263888888888888 | 3.525 |
| 0.8270833333333334 | 0 |
| 0.8277777777777778 | 0 |
| 0.8284722222222222 | 0 |
| 0.8291666666666666 | 0 |
| 0.8298611111111112 | 0 |
| 0.8305555555555556 | 0 |
| 0.8312499999999999 | 0 |
| 0.8319444444444444 | 0 |
| 0.8326388888888889 | 0 |
| 0.8333333333333334 | 0 |
| 0.8340277777777777 | 0 |
| 0.8347222222222223 | 0 |
| 0.8354166666666667 | 0 |
| 0.8361111111111111 | 0 |
| 0.8368055555555555 | 0 |
| 0.8375 | 0 |
| 0.8381944444444445 | 0 |
| 0.8388888888888889 | 0 |
| 0.8395833333333332 | 0 |
| 0.8402777777777778 | 0 |
| 0.8409722222222222 | 0 |
| 0.8416666666666667 | 0 |
| 0.842361111111111 | 0 |
| 0.8430555555555556 | 0 |
| 0.84375 | 0 |
| 0.8444444444444444 | 0 |
| 0.845138888888889 | 0 |
| 0.8458333333333333 | 0 |
| 0.8465277777777778 | 0 |
| 0.8472222222222222 | 0 |
| 0.8479166666666668 | 0 |
| 0.8486111111111111 | 0 |
| 0.8493055555555555 | 0 |
| 0.85 | 0 |
| 0.8506944444444445 | 0 |
| 0.8513888888888889 | 0 |
| 0.8520833333333333 | 0 |
| 0.8527777777777777 | 0 |
| 0.8534722222222223 | 0 |
| 0.8541666666666666 | 0 |
| 0.8548611111111111 | 0 |
| 0.8555555555555556 | 0 |
| 0.8562500000000001 | 0 |
| 0.8569444444444444 | 0 |
| 0.8576388888888888 | 0 |
| 0.8583333333333334 | 0 |
| 0.8590277777777778 | 0 |
| 0.8597222222222222 | 0 |
| 0.8604166666666666 | 0 |
| 0.8611111111111112 | 0 |
| 0.8618055555555556 | 0 |
| 0.8624999999999999 | 0 |
| 0.8631944444444444 | 0 |
| 0.8638888888888889 | 0 |
| 0.8645833333333334 | 0 |
| 0.8652777777777777 | 0 |
| 0.8659722222222223 | 0 |
| 0.8666666666666667 | 0 |
| 0.8673611111111111 | 0 |
| 0.8680555555555555 | 0 |
| 0.86875 | 0 |
| 0.8694444444444445 | 0 |
| 0.8701388888888889 | 0 |
| 0.8708333333333332 | 0 |
| 0.8715277777777778 | 0 |
| 0.8722222222222222 | 0 |
| 0.8729166666666667 | 0 |
| 0.873611111111111 | 0 |
| 0.8743055555555556 | 0 |
| 0.875 | 0 |
| 0.8756944444444444 | 0 |
| 0.876388888888889 | 0 |
| 0.8770833333333333 | 0 |
| 0.8777777777777778 | 0 |
| 0.8784722222222222 | 0 |
| 0.8791666666666668 | 0 |
| 0.8798611111111111 | 0 |
| 0.8805555555555555 | 0 |
| 0.88125 | 0 |
| 0.8819444444444445 | 0 |
| 0.8826388888888889 | 0 |
| 0.8833333333333333 | 0 |
| 0.8840277777777777 | 0 |
| 0.8847222222222223 | 0 |
| 0.8854166666666666 | 0 |
| 0.8861111111111111 | 0 |
| 0.8868055555555556 | 0 |
| 0.8875000000000001 | 0 |
| 0.8881944444444444 | 0 |
| 0.8888888888888888 | 0 |
| 0.8895833333333334 | 0 |
| 0.8902777777777778 | 0 |
| 0.8909722222222222 | 0 |
| 0.8916666666666666 | 0 |
| 0.8923611111111112 | 0 |
| 0.8930555555555556 | 0 |
| 0.8937499999999999 | 0 |
| 0.8944444444444444 | 0 |
| 0.8951388888888889 | 0 |
| 0.8958333333333334 | 0 |
| 0.8965277777777777 | 0 |
| 0.8972222222222223 | 0 |
| 0.8979166666666667 | 0 |
| 0.8986111111111111 | 0 |
| 0.8993055555555555 | 0 |
| 0.9 | 0 |
| 0.9006944444444445 | 0 |
| 0.9013888888888889 | 0 |
| 0.9020833333333332 | 0 |
| 0.9027777777777778 | 0 |
| 0.9034722222222222 | 0 |
| 0.9041666666666667 | 0 |
| 0.904861111111111 | 0 |
| 0.9055555555555556 | 0 |
| 0.90625 | 0 |
| 0.9069444444444444 | 0 |
| 0.907638888888889 | 0 |
| 0.9083333333333333 | 0 |
| 0.9090277777777778 | 0 |
| 0.9097222222222222 | 0 |
| 0.9104166666666668 | 0 |
| 0.9111111111111111 | 0 |
| 0.9118055555555555 | 0 |
| 0.9125 | 0 |
| 0.9131944444444445 | 0 |
| 0.9138888888888889 | 0 |
| 0.9145833333333333 | 0 |
| 0.9152777777777777 | 0 |
| 0.9159722222222223 | 0 |
| 0.9166666666666666 | 0 |
| 0.9173611111111111 | 0 |
| 0.9180555555555556 | 0 |
| 0.9187500000000001 | 0 |
| 0.9194444444444444 | 0 |
| 0.9201388888888888 | 0 |
| 0.9208333333333334 | 0 |
| 0.9215277777777778 | 0 |
| 0.9222222222222222 | 0 |
| 0.9229166666666666 | 0 |
| 0.9236111111111112 | 0 |
| 0.9243055555555556 | 0 |
| 0.9249999999999999 | 0 |
| 0.9256944444444444 | 0 |
| 0.9263888888888889 | 0 |
| 0.9270833333333334 | 0 |
| 0.9277777777777777 | 0 |
| 0.9284722222222223 | 0 |
| 0.9291666666666667 | 0 |
| 0.9298611111111111 | 0 |
| 0.9305555555555555 | 0 |
| 0.93125 | 0 |
| 0.9319444444444445 | 0 |
| 0.9326388888888889 | 0 |
| 0.9333333333333332 | 0 |
| 0.9340277777777778 | 0 |
| 0.9347222222222222 | 0 |
| 0.9354166666666667 | 0 |
| 0.936111111111111 | 0 |
| 0.9368055555555556 | 0 |
| 0.9375 | 0 |
| 0.9381944444444444 | 0 |
| 0.938888888888889 | 0 |
| 0.9395833333333333 | 0 |
| 0.9402777777777778 | 0 |
| 0.9409722222222222 | 0 |
| 0.9416666666666668 | 0 |
| 0.9423611111111111 | 0 |
| 0.9430555555555555 | 0 |
| 0.94375 | 0 |
| 0.9444444444444445 | 0 |
| 0.9451388888888889 | 0 |
| 0.9458333333333333 | 0 |
| 0.9465277777777777 | 0 |
| 0.9472222222222223 | 0 |
| 0.9479166666666666 | 0 |
| 0.9486111111111111 | 0 |
| 0.9493055555555556 | 0 |
| 0.9500000000000001 | 0 |
| 0.9506944444444444 | 0 |
| 0.9513888888888888 | 0 |
| 0.9520833333333334 | 0 |
| 0.9527777777777778 | 0 |
| 0.9534722222222222 | 0 |
| 0.9541666666666666 | 0 |
| 0.9548611111111112 | 0 |
| 0.9555555555555556 | 0 |
| 0.9562499999999999 | 0 |
| 0.9569444444444444 | 0 |
| 0.9576388888888889 | 0 |
| 0.9583333333333334 | 0 |
| 0.9590277777777777 | 0 |
| 0.9597222222222223 | 0 |
| 0.9604166666666667 | 0 |
| 0.9611111111111111 | 0 |
| 0.9618055555555555 | 0 |
| 0.9625 | 0 |
| 0.9631944444444445 | 0 |
| 0.9638888888888889 | 0 |
| 0.9645833333333332 | 0 |
| 0.9652777777777778 | 0 |
| 0.9659722222222222 | 0 |
| 0.9666666666666667 | 0 |
| 0.967361111111111 | 0 |
| 0.9680555555555556 | 0 |
| 0.96875 | 0 |
| 0.9694444444444444 | 0 |
| 0.970138888888889 | 0 |
| 0.9708333333333333 | 0 |
| 0.9715277777777778 | 0 |
| 0.9722222222222222 | 0 |
| 0.9729166666666668 | 0 |
| 0.9736111111111111 | 0 |
| 0.9743055555555555 | 0 |
| 0.975 | 0 |
| 0.9756944444444445 | 0 |
| 0.9763888888888889 | 0 |
| 0.9770833333333333 | 0 |
| 0.9777777777777777 | 0 |
| 0.9784722222222223 | 0 |
| 0.9791666666666666 | 0 |
| 0.9798611111111111 | 0 |
| 0.9805555555555556 | 0 |
| 0.9812500000000001 | 0 |
| 0.9819444444444444 | 0 |
| 0.9826388888888888 | 0 |
| 0.9833333333333334 | 0 |
| 0.9840277777777778 | 0 |
| 0.9847222222222222 | 0 |
| 0.9854166666666666 | 0 |
| 0.9861111111111112 | 0 |
| 0.9868055555555556 | 0 |
| 0.9874999999999999 | 0 |
| 0.9881944444444444 | 0 |
| 0.9888888888888889 | 0 |
| 0.9895833333333334 | 0 |
| 0.9902777777777777 | 0 |
| 0.9909722222222223 | 0 |
| 0.9916666666666667 | 0 |
| 0.9923611111111111 | 0 |
| 0.9930555555555555 | 0 |
| 0.99375 | 0 |
| 0.9944444444444445 | 0 |
| 0.9951388888888889 | 0 |
| 0.9958333333333332 | 0 |
| 0.9965277777777778 | 0 |
| 0.9972222222222222 | 0 |
| 0.9979166666666667 | 0 |
| 0.998611111111111 | 0 |
| 0.9993055555555556 | 0 |